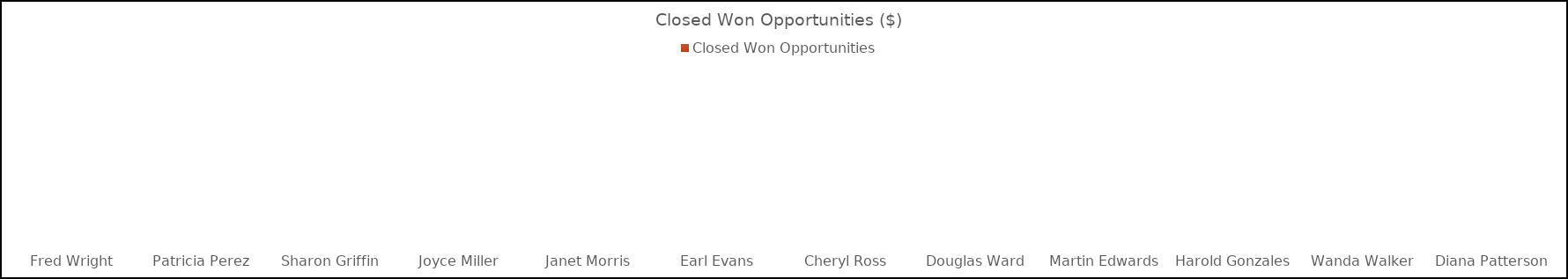
| Category | Closed Won Opportunities  |
|---|---|
| Fred Wright | 0 |
| Patricia Perez | 0 |
| Sharon Griffin | 0 |
| Joyce Miller | 0 |
| Janet Morris | 0 |
| Earl Evans | 0 |
| Cheryl Ross | 0 |
| Douglas Ward | 0 |
| Martin Edwards | 0 |
| Harold Gonzales | 0 |
| Wanda Walker | 0 |
| Diana Patterson | 0 |